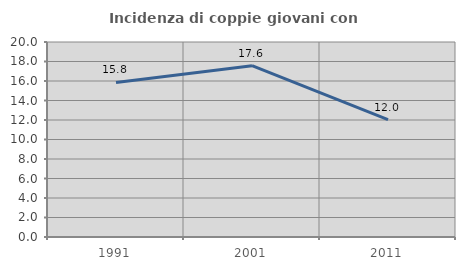
| Category | Incidenza di coppie giovani con figli |
|---|---|
| 1991.0 | 15.847 |
| 2001.0 | 17.57 |
| 2011.0 | 12.04 |